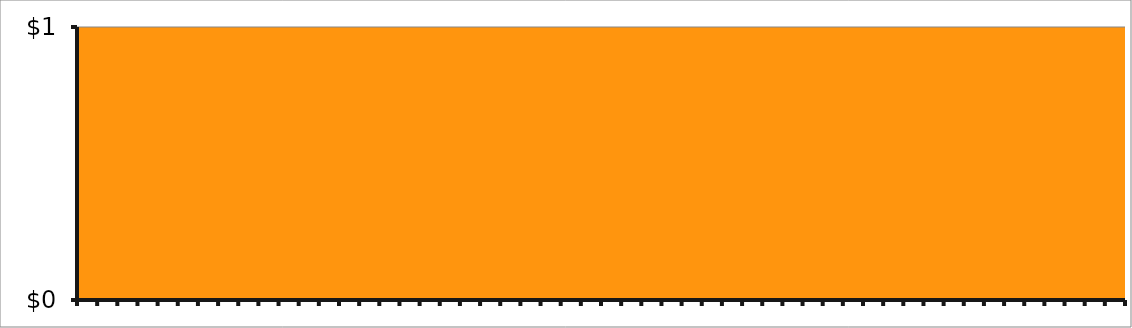
| Category | Untitled 1 |
|---|---|
| 0 | 0 |
| 1 | 0 |
| 2 | 0 |
| 3 | 0 |
| 4 | 0 |
| 5 | 0 |
| 6 | 0 |
| 7 | 0 |
| 8 | 0 |
| 9 | 0 |
| 10 | 0 |
| 11 | 0 |
| 12 | 0 |
| 13 | 0 |
| 14 | 0 |
| 15 | 0 |
| 16 | 0 |
| 17 | 0 |
| 18 | 0 |
| 19 | 0 |
| 20 | 0 |
| 21 | 0 |
| 22 | 0 |
| 23 | 0 |
| 24 | 0 |
| 25 | 0 |
| 26 | 0 |
| 27 | 0 |
| 28 | 0 |
| 29 | 0 |
| 30 | 0 |
| 31 | 0 |
| 32 | 0 |
| 33 | 0 |
| 34 | 0 |
| 35 | 0 |
| 36 | 0 |
| 37 | 0 |
| 38 | 0 |
| 39 | 0 |
| 40 | 0 |
| 41 | 0 |
| 42 | 0 |
| 43 | 0 |
| 44 | 0 |
| 45 | 0 |
| 46 | 0 |
| 47 | 0 |
| 48 | 0 |
| 49 | 0 |
| 50 | 0 |
| 51 | 0 |
| 52 | 0 |